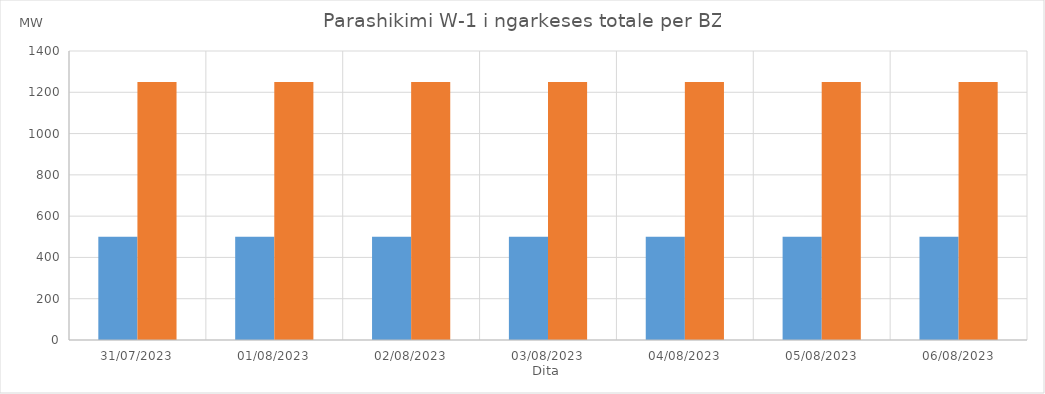
| Category | Min (MW) | Max (MW) |
|---|---|---|
| 31/07/2023 | 500 | 1250 |
| 01/08/2023 | 500 | 1250 |
| 02/08/2023 | 500 | 1250 |
| 03/08/2023 | 500 | 1250 |
| 04/08/2023 | 500 | 1250 |
| 05/08/2023 | 500 | 1250 |
| 06/08/2023 | 500 | 1250 |